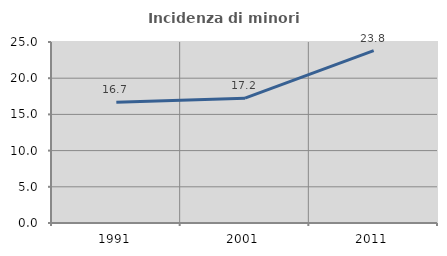
| Category | Incidenza di minori stranieri |
|---|---|
| 1991.0 | 16.667 |
| 2001.0 | 17.241 |
| 2011.0 | 23.81 |